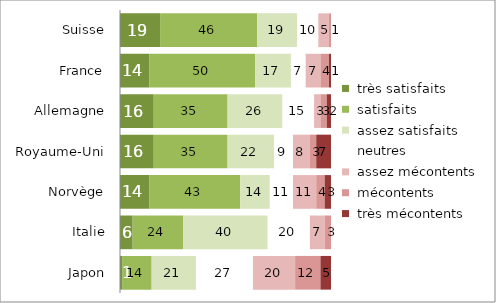
| Category |  très satisfaits |  satisfaits |  assez satisfaits |  neutres |  assez mécontents |  mécontents |  très mécontents |
|---|---|---|---|---|---|---|---|
|  Japon | 1 | 14 | 21 | 27 | 20 | 12 | 5 |
|  Italie | 6 | 24 | 40 | 20 | 7 | 3 | 0 |
|  Norvège | 14 | 43 | 14 | 11 | 11 | 4 | 3 |
|  Royaume-Uni | 16 | 35 | 22 | 9 | 8 | 3 | 7 |
|  Allemagne | 16 | 35 | 26 | 15 | 3 | 3 | 2 |
|  France | 14 | 50 | 17 | 7 | 7 | 4 | 1 |
|  Suisse | 19 | 46 | 19 | 10 | 5 | 1 | 0 |